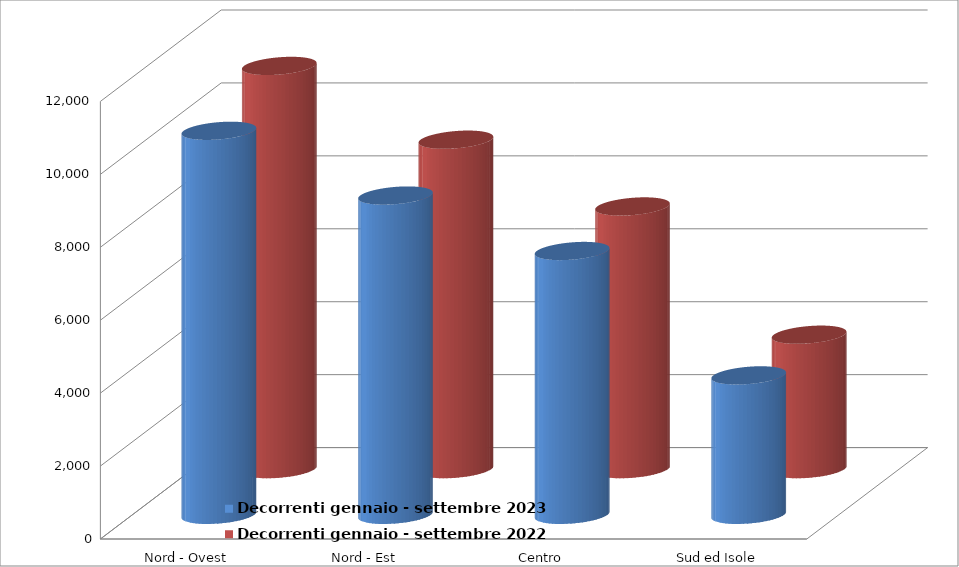
| Category | Decorrenti gennaio - settembre 2023 | Decorrenti gennaio - settembre 2022 |
|---|---|---|
| Nord - Ovest | 10532 | 11058 |
| Nord - Est | 8757 | 9035 |
| Centro | 7236 | 7204 |
| Sud ed Isole | 3825 | 3687 |